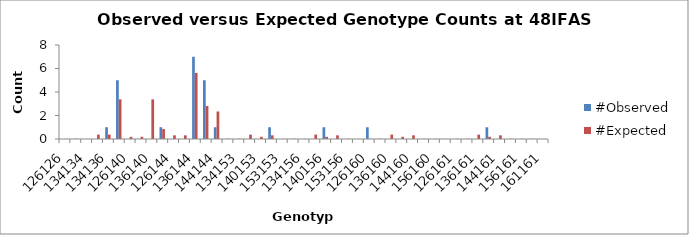
| Category | #Observed | #Expected |
|---|---|---|
| 126126.0 | 0 | 0.01 |
| 126134.0 | 0 | 0.021 |
| 134134.0 | 0 | 0.01 |
| 126136.0 | 0 | 0.375 |
| 134136.0 | 1 | 0.375 |
| 136136.0 | 5 | 3.375 |
| 126140.0 | 0 | 0.188 |
| 134140.0 | 0 | 0.188 |
| 136140.0 | 0 | 3.375 |
| 140140.0 | 1 | 0.844 |
| 126144.0 | 0 | 0.312 |
| 134144.0 | 0 | 0.312 |
| 136144.0 | 7 | 5.625 |
| 140144.0 | 5 | 2.812 |
| 144144.0 | 1 | 2.344 |
| 126153.0 | 0 | 0.021 |
| 134153.0 | 0 | 0.021 |
| 136153.0 | 0 | 0.375 |
| 140153.0 | 0 | 0.188 |
| 144153.0 | 1 | 0.312 |
| 153153.0 | 0 | 0.01 |
| 126156.0 | 0 | 0.021 |
| 134156.0 | 0 | 0.021 |
| 136156.0 | 0 | 0.375 |
| 140156.0 | 1 | 0.188 |
| 144156.0 | 0 | 0.312 |
| 153156.0 | 0 | 0.021 |
| 156156.0 | 0 | 0.01 |
| 126160.0 | 1 | 0.021 |
| 134160.0 | 0 | 0.021 |
| 136160.0 | 0 | 0.375 |
| 140160.0 | 0 | 0.188 |
| 144160.0 | 0 | 0.312 |
| 153160.0 | 0 | 0.021 |
| 156160.0 | 0 | 0.021 |
| 160160.0 | 0 | 0.01 |
| 126161.0 | 0 | 0.021 |
| 134161.0 | 0 | 0.021 |
| 136161.0 | 0 | 0.375 |
| 140161.0 | 1 | 0.188 |
| 144161.0 | 0 | 0.312 |
| 153161.0 | 0 | 0.021 |
| 156161.0 | 0 | 0.021 |
| 160161.0 | 0 | 0.021 |
| 161161.0 | 0 | 0.01 |